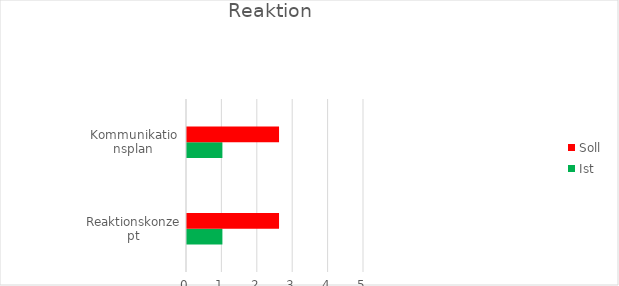
| Category | Ist | Soll |
|---|---|---|
| Reaktionskonzept | 1 | 2.6 |
| Kommunikationsplan | 1 | 2.6 |